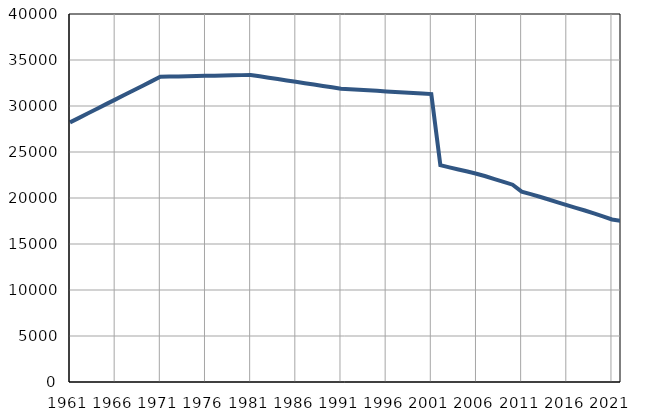
| Category | Population
size |
|---|---|
| 1961.0 | 28217 |
| 1962.0 | 28713 |
| 1963.0 | 29208 |
| 1964.0 | 29705 |
| 1965.0 | 30200 |
| 1966.0 | 30695 |
| 1967.0 | 31191 |
| 1968.0 | 31686 |
| 1969.0 | 32182 |
| 1970.0 | 32677 |
| 1971.0 | 33173 |
| 1972.0 | 33193 |
| 1973.0 | 33214 |
| 1974.0 | 33234 |
| 1975.0 | 33254 |
| 1976.0 | 33275 |
| 1977.0 | 33295 |
| 1978.0 | 33315 |
| 1979.0 | 33335 |
| 1980.0 | 33356 |
| 1981.0 | 33376 |
| 1982.0 | 33227 |
| 1983.0 | 33077 |
| 1984.0 | 32928 |
| 1985.0 | 32778 |
| 1986.0 | 32629 |
| 1987.0 | 32479 |
| 1988.0 | 32330 |
| 1989.0 | 32180 |
| 1990.0 | 32031 |
| 1991.0 | 31881 |
| 1992.0 | 31822 |
| 1993.0 | 31763 |
| 1994.0 | 31704 |
| 1995.0 | 31646 |
| 1996.0 | 31586 |
| 1997.0 | 31527 |
| 1998.0 | 31469 |
| 1999.0 | 31410 |
| 2000.0 | 31351 |
| 2001.0 | 31292 |
| 2002.0 | 23574 |
| 2003.0 | 23331 |
| 2004.0 | 23097 |
| 2005.0 | 22873 |
| 2006.0 | 22640 |
| 2007.0 | 22364 |
| 2008.0 | 22055 |
| 2009.0 | 21757 |
| 2010.0 | 21445 |
| 2011.0 | 20691 |
| 2012.0 | 20416 |
| 2013.0 | 20136 |
| 2014.0 | 19834 |
| 2015.0 | 19532 |
| 2016.0 | 19222 |
| 2017.0 | 18926 |
| 2018.0 | 18643 |
| 2019.0 | 18332 |
| 2020.0 | 18002 |
| 2021.0 | 17665 |
| 2022.0 | 17509 |